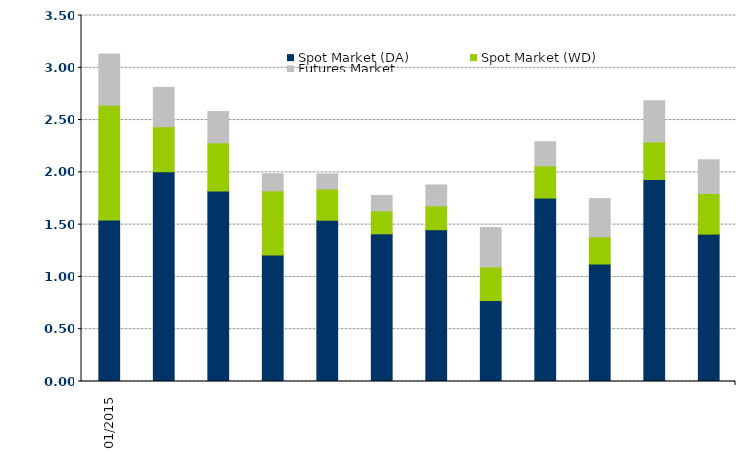
| Category | Spot Market (DA) | Spot Market (WD) | Futures Market |
|---|---|---|---|
| 2013-01-01 | 0 | 0 | 0 |
| 2013-02-01 | 0 | 0 | 0 |